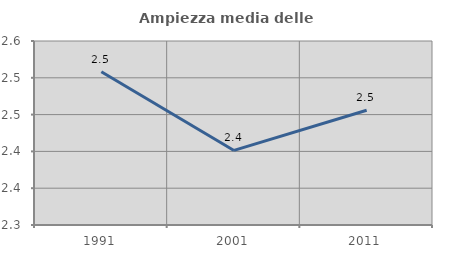
| Category | Ampiezza media delle famiglie |
|---|---|
| 1991.0 | 2.508 |
| 2001.0 | 2.401 |
| 2011.0 | 2.456 |